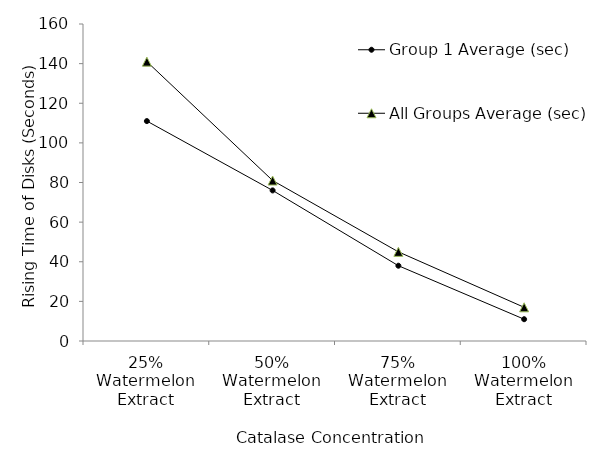
| Category | Group 1 Average (sec) | All Groups Average (sec) |
|---|---|---|
| 25% Watermelon Extract | 111 | 141 |
| 50% Watermelon Extract | 76 | 81 |
| 75% Watermelon Extract | 38 | 45 |
| 100% Watermelon Extract | 11 | 17 |